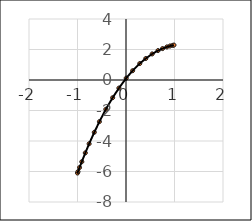
| Category | Series 0 |
|---|---|
| -1.0 | -6.1 |
| -0.99 | -6.01 |
| -0.958 | -5.74 |
| -0.911 | -5.36 |
| -0.839 | -4.78 |
| -0.76 | -4.18 |
| -0.654 | -3.43 |
| -0.548 | -2.73 |
| -0.416 | -1.92 |
| -0.275 | -1.16 |
| -0.146 | -0.53 |
| 0.004 | 0.12 |
| 0.137 | 0.61 |
| 0.284 | 1.08 |
| 0.408 | 1.41 |
| 0.54 | 1.71 |
| 0.66 | 1.93 |
| 0.754 | 2.06 |
| 0.844 | 2.17 |
| 0.907 | 2.23 |
| 0.96 | 2.27 |
| 0.989 | 2.29 |